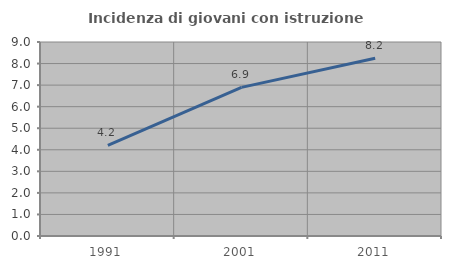
| Category | Incidenza di giovani con istruzione universitaria |
|---|---|
| 1991.0 | 4.206 |
| 2001.0 | 6.897 |
| 2011.0 | 8.247 |